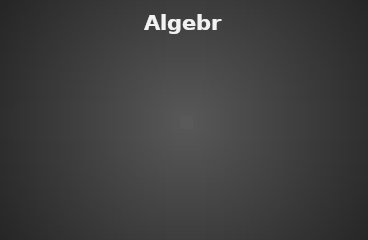
| Category | Algebra |
|---|---|
| % of Students passed | 0 |
| % of Students need improvement | 0 |